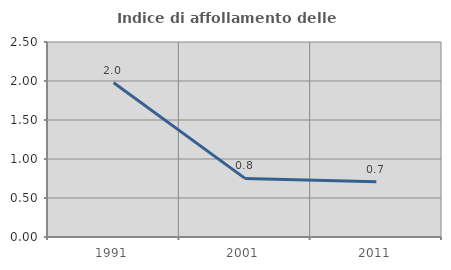
| Category | Indice di affollamento delle abitazioni  |
|---|---|
| 1991.0 | 1.977 |
| 2001.0 | 0.751 |
| 2011.0 | 0.708 |